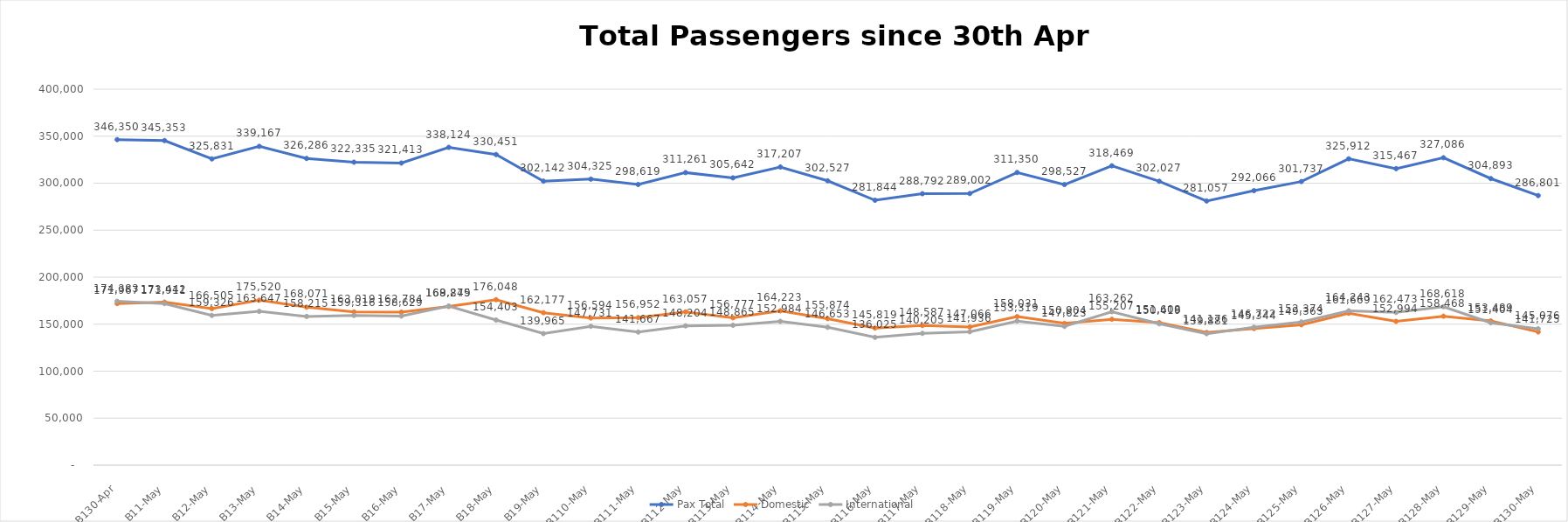
| Category | Pax Total |  Domestic  |  International  |
|---|---|---|---|
| 2023-04-30 | 346350 | 171967 | 174383 |
| 2023-05-01 | 345353 | 173442 | 171911 |
| 2023-05-02 | 325831 | 166505 | 159326 |
| 2023-05-03 | 339167 | 175520 | 163647 |
| 2023-05-04 | 326286 | 168071 | 158215 |
| 2023-05-05 | 322335 | 163019 | 159316 |
| 2023-05-06 | 321413 | 162784 | 158629 |
| 2023-05-07 | 338124 | 168849 | 169275 |
| 2023-05-08 | 330451 | 176048 | 154403 |
| 2023-05-09 | 302142 | 162177 | 139965 |
| 2023-05-10 | 304325 | 156594 | 147731 |
| 2023-05-11 | 298619 | 156952 | 141667 |
| 2023-05-12 | 311261 | 163057 | 148204 |
| 2023-05-13 | 305642 | 156777 | 148865 |
| 2023-05-14 | 317207 | 164223 | 152984 |
| 2023-05-15 | 302527 | 155874 | 146653 |
| 2023-05-16 | 281844 | 145819 | 136025 |
| 2023-05-17 | 288792 | 148587 | 140205 |
| 2023-05-18 | 289002 | 147066 | 141936 |
| 2023-05-19 | 311350 | 158031 | 153319 |
| 2023-05-20 | 298527 | 150904 | 147623 |
| 2023-05-21 | 318469 | 155207 | 163262 |
| 2023-05-22 | 302027 | 151608 | 150419 |
| 2023-05-23 | 281057 | 141176 | 139881 |
| 2023-05-24 | 292066 | 145344 | 146722 |
| 2023-05-25 | 301737 | 149363 | 152374 |
| 2023-05-26 | 325912 | 161669 | 164243 |
| 2023-05-27 | 315467 | 152994 | 162473 |
| 2023-05-28 | 327086 | 158468 | 168618 |
| 2023-05-29 | 304893 | 153489 | 151404 |
| 2023-05-30 | 286801 | 141725 | 145076 |